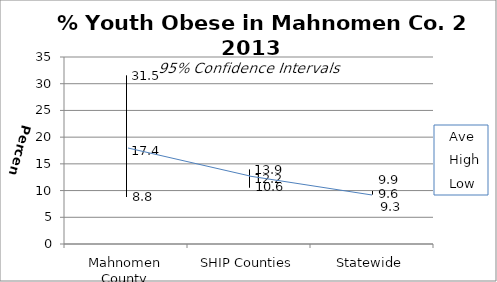
| Category | Ave | High | Low |
|---|---|---|---|
| Mahnomen County | 17.4 | 31.5 | 8.8 |
| SHIP Counties | 12.2 | 13.9 | 10.6 |
| Statewide | 9.6 | 9.9 | 9.3 |